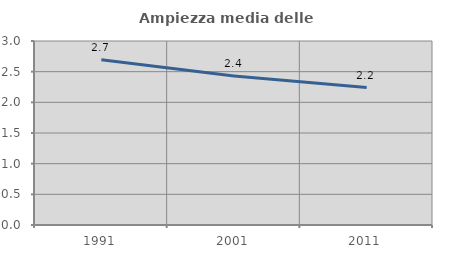
| Category | Ampiezza media delle famiglie |
|---|---|
| 1991.0 | 2.695 |
| 2001.0 | 2.43 |
| 2011.0 | 2.241 |